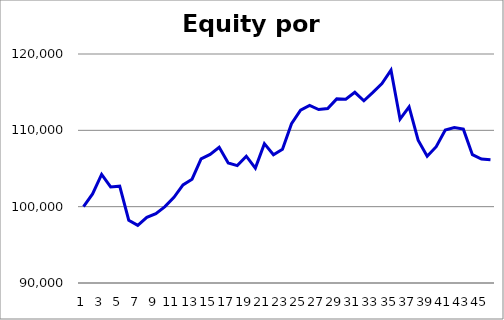
| Category | Series 0 |
|---|---|
| 0 | 100000 |
| 1 | 101674.88 |
| 2 | 104232.67 |
| 3 | 102579.47 |
| 4 | 102680.41 |
| 5 | 98223.51 |
| 6 | 97544.99 |
| 7 | 98592.77 |
| 8 | 99091.43 |
| 9 | 100010.36 |
| 10 | 101229.51 |
| 11 | 102853.7 |
| 12 | 103605.04 |
| 13 | 106271.18 |
| 14 | 106847.31 |
| 15 | 107777.17 |
| 16 | 105721.92 |
| 17 | 105379.77 |
| 18 | 106613.41 |
| 19 | 105051.4 |
| 20 | 108258.6 |
| 21 | 106808.6 |
| 22 | 107519.34 |
| 23 | 110873.96 |
| 24 | 112651.27 |
| 25 | 113253.68 |
| 26 | 112727.23 |
| 27 | 112847 |
| 28 | 114119.34 |
| 29 | 114083.74 |
| 30 | 114984.75 |
| 31 | 113874.64 |
| 32 | 114978.15 |
| 33 | 116136.43 |
| 34 | 117876.71 |
| 35 | 111463.22 |
| 36 | 113081.35 |
| 37 | 108719.34 |
| 38 | 106605.84 |
| 39 | 107856.44 |
| 40 | 110041.04 |
| 41 | 110366.4 |
| 42 | 110156.91 |
| 43 | 106809.13 |
| 44 | 106243.89 |
| 45 | 106138.11 |